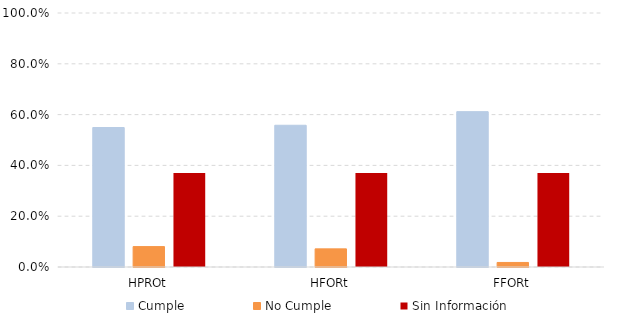
| Category | Cumple | No Cumple | Sin Información |
|---|---|---|---|
| HPROt | 0.549 | 0.08 | 0.371 |
| HFORt | 0.558 | 0.071 | 0.371 |
| FFORt | 0.612 | 0.018 | 0.371 |